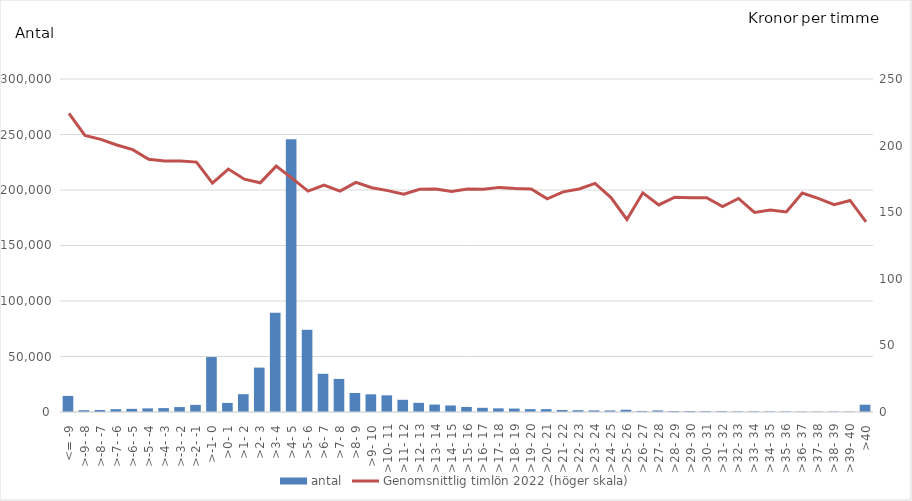
| Category | antal |
|---|---|
| <= -9 | 14484 |
| >-9- -8 | 1601 |
| >-8- -7 | 1802 |
| >-7- -6 | 2541 |
| >-6- -5 | 2830 |
| >-5- -4 | 3264 |
| >-4- -3 | 3515 |
| >-3- -2 | 4451 |
| >-2- -1 | 6422 |
| >-1- 0 | 49505 |
| >0- 1 | 8168 |
| >1- 2 | 16064 |
| >2- 3 | 40000 |
| >3- 4 | 89349 |
| >4- 5 | 245642 |
| >5- 6 | 74058 |
| >6- 7 | 34428 |
| >7- 8 | 29799 |
| >8- 9 | 17160 |
| >9- 10 | 15924 |
| >10- 11 | 15016 |
| >11- 12 | 10985 |
| >12- 13 | 8214 |
| >13- 14 | 6711 |
| >14- 15 | 5899 |
| >15- 16 | 4556 |
| >16- 17 | 3768 |
| >17- 18 | 3283 |
| >18- 19 | 3084 |
| >19- 20 | 2575 |
| >20- 21 | 2574 |
| >21- 22 | 1783 |
| >22- 23 | 1625 |
| >23- 24 | 1435 |
| >24- 25 | 1358 |
| >25- 26 | 2001 |
| >26- 27 | 945 |
| >27- 28 | 1433 |
| >28- 29 | 847 |
| >29- 30 | 861 |
| >30- 31 | 738 |
| >31- 32 | 727 |
| >32- 33 | 561 |
| >33- 34 | 601 |
| >34- 35 | 493 |
| >35- 36 | 478 |
| >36- 37 | 375 |
| >37- 38 | 342 |
| >38- 39 | 411 |
| >39- 40 | 336 |
| >40 | 6566 |